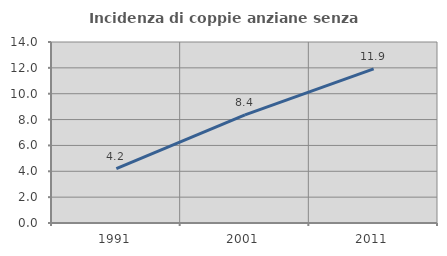
| Category | Incidenza di coppie anziane senza figli  |
|---|---|
| 1991.0 | 4.205 |
| 2001.0 | 8.367 |
| 2011.0 | 11.919 |